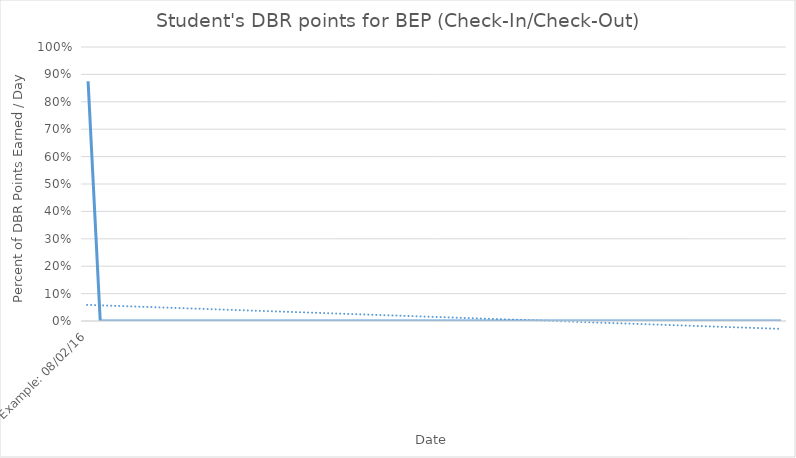
| Category | Series 0 |
|---|---|
| Example: 08/02/16 | 0.875 |